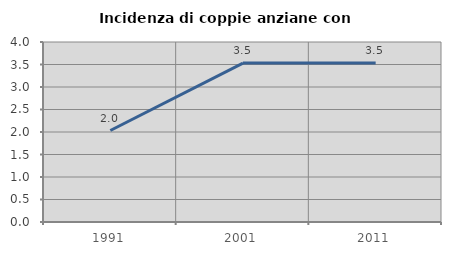
| Category | Incidenza di coppie anziane con figli |
|---|---|
| 1991.0 | 2.033 |
| 2001.0 | 3.532 |
| 2011.0 | 3.535 |